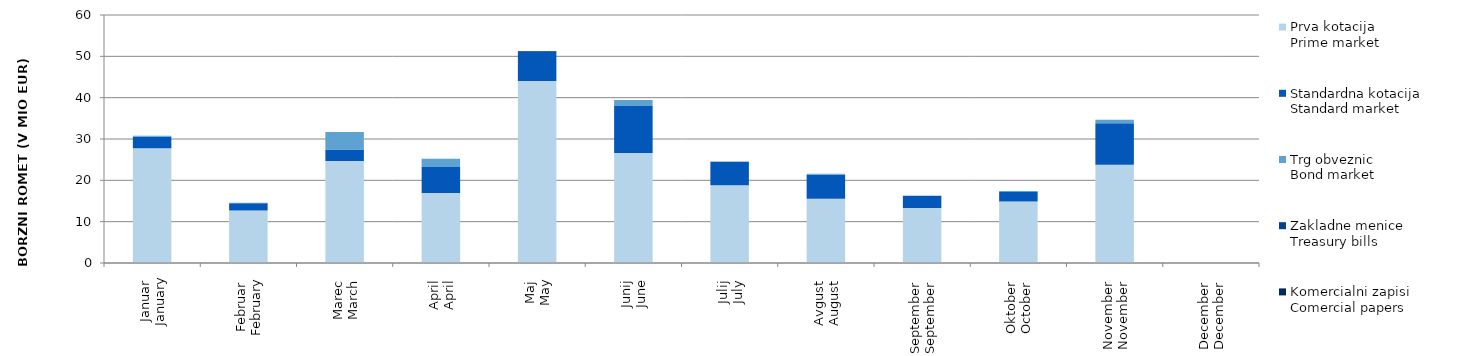
| Category | Prva kotacija
Prime market | Standardna kotacija
Standard market | Trg obveznic
Bond market | Zakladne menice
Treasury bills | Komercialni zapisi
Comercial papers |
|---|---|---|---|---|---|
| Januar
January | 27.745 | 2.796 | 0.249 | 0 | 0 |
| Februar
February | 12.685 | 1.784 | 0.118 | 0 | 0 |
| Marec
March | 24.676 | 2.813 | 4.174 | 0 | 0 |
| April
April | 16.942 | 6.272 | 2.01 | 0 | 0 |
| Maj
May | 44.02 | 7.1 | 0 | 0.145 | 0 |
| Junij
June | 26.612 | 11.39 | 1.425 | 0 | 0 |
| Julij
July | 18.826 | 5.646 | 0.075 | 0 | 0 |
| Avgust
August | 15.523 | 5.813 | 0.265 | 0 | 0 |
| September
September | 13.292 | 2.966 | 0.029 | 0 | 0 |
| Oktober
October | 14.908 | 2.252 | 0.23 | 0 | 0 |
| November
November | 23.743 | 10.076 | 0.813 | 0 | 0 |
| December
December | 0 | 0 | 0 | 0 | 0 |